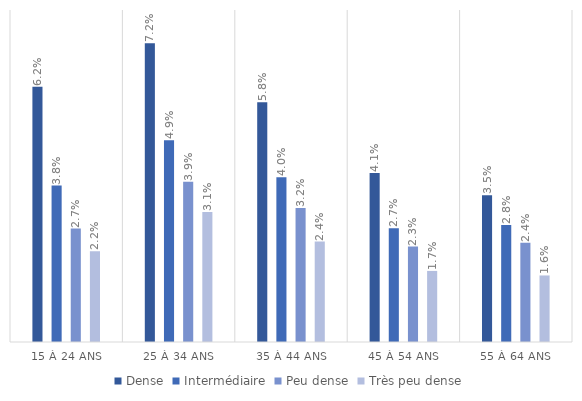
| Category | Dense | Intermédiaire | Peu dense | Très peu dense |
|---|---|---|---|---|
| 15 à 24 ans | 0.062 | 0.038 | 0.027 | 0.022 |
| 25 à 34 ans | 0.072 | 0.049 | 0.039 | 0.031 |
| 35 à 44 ans | 0.058 | 0.04 | 0.032 | 0.024 |
| 45 à 54 ans | 0.041 | 0.027 | 0.023 | 0.017 |
| 55 à 64 ans | 0.035 | 0.028 | 0.024 | 0.016 |